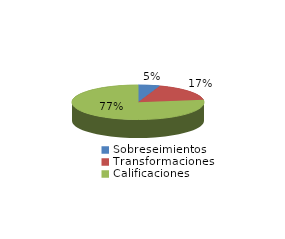
| Category | Series 0 |
|---|---|
| Sobreseimientos | 210 |
| Transformaciones | 684 |
| Calificaciones | 3039 |